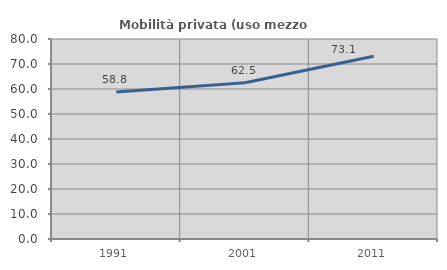
| Category | Mobilità privata (uso mezzo privato) |
|---|---|
| 1991.0 | 58.791 |
| 2001.0 | 62.505 |
| 2011.0 | 73.126 |